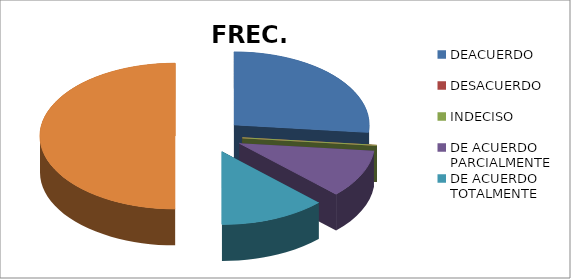
| Category | FREC. | % |
|---|---|---|
| DEACUERDO | 250 | 53 |
| DESACUERDO | 0 | 0 |
| INDECISO | 0 | 0 |
| DE ACUERDO PARCIALMENTE | 100 | 21 |
| DE ACUERDO TOTALMENTE | 119 | 25 |
| TOTAL | 469 | 1 |